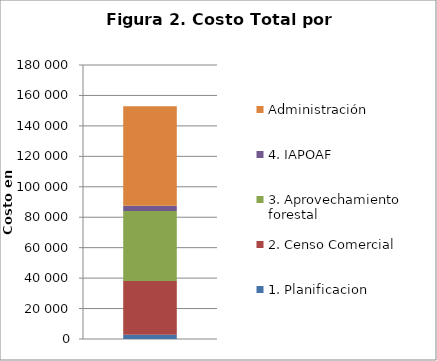
| Category | 1. Planificacion | 2. Censo Comercial | 3. Aprovechamiento forestal | 4. IAPOAF | Administración |
|---|---|---|---|---|---|
| 0 | 2771.6 | 35367.92 | 45868.38 | 3500 | 65402.5 |